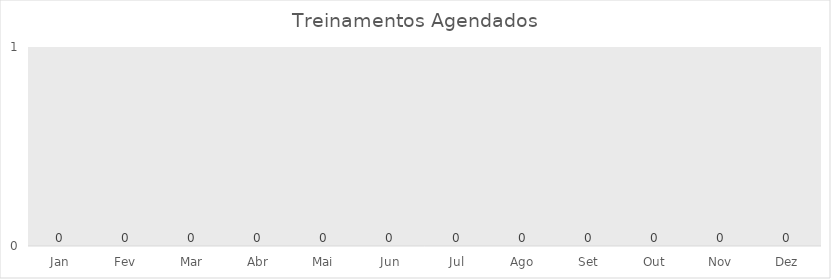
| Category | Treinamentos Agendados |
|---|---|
| Jan | 0 |
| Fev | 0 |
| Mar | 0 |
| Abr | 0 |
| Mai | 0 |
| Jun | 0 |
| Jul | 0 |
| Ago | 0 |
| Set | 0 |
| Out | 0 |
| Nov | 0 |
| Dez | 0 |